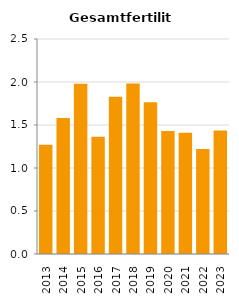
| Category | Gesamtfertilität |
|---|---|
| 2013.0 | 1.269 |
| 2014.0 | 1.581 |
| 2015.0 | 1.979 |
| 2016.0 | 1.363 |
| 2017.0 | 1.829 |
| 2018.0 | 1.982 |
| 2019.0 | 1.765 |
| 2020.0 | 1.43 |
| 2021.0 | 1.411 |
| 2022.0 | 1.22 |
| 2023.0 | 1.436 |